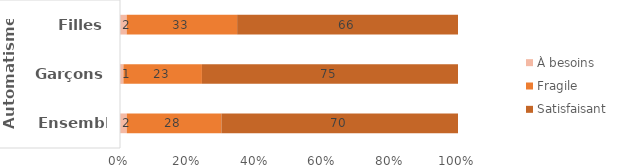
| Category | À besoins | Fragile | Satisfaisant |
|---|---|---|---|
| 0 | 2 | 28 | 70 |
| 1 | 1 | 23 | 75 |
| 2 | 2 | 33 | 66 |